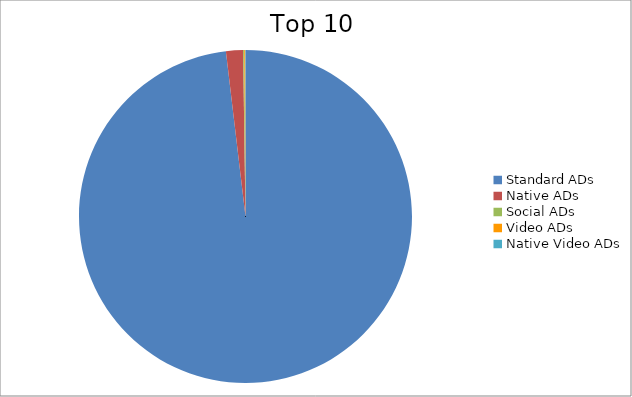
| Category | Series 0 |
|---|---|
| Standard ADs | 98.12 |
| Native ADs | 1.65 |
| Social ADs | 0.11 |
| Video ADs | 0.09 |
| Native Video ADs | 0.03 |